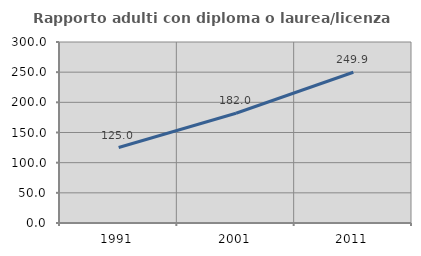
| Category | Rapporto adulti con diploma o laurea/licenza media  |
|---|---|
| 1991.0 | 125.041 |
| 2001.0 | 181.961 |
| 2011.0 | 249.864 |